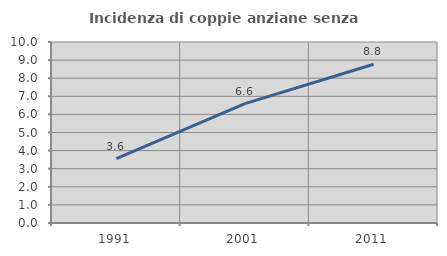
| Category | Incidenza di coppie anziane senza figli  |
|---|---|
| 1991.0 | 3.556 |
| 2001.0 | 6.595 |
| 2011.0 | 8.769 |